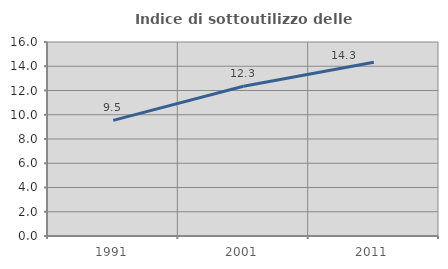
| Category | Indice di sottoutilizzo delle abitazioni  |
|---|---|
| 1991.0 | 9.538 |
| 2001.0 | 12.348 |
| 2011.0 | 14.334 |